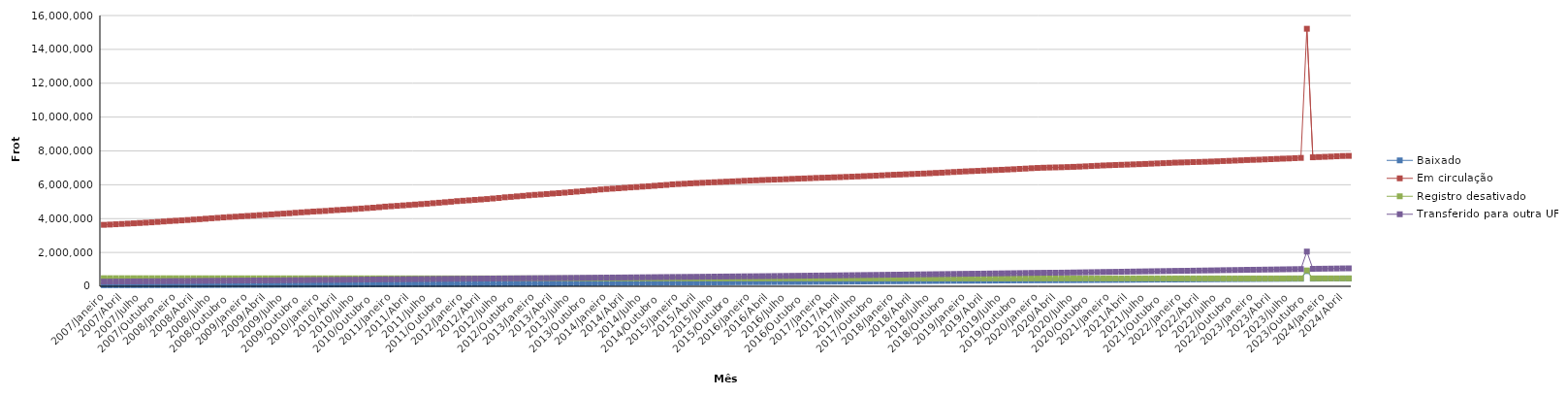
| Category | Baixado | Em circulação | Registro desativado | Transferido para outra UF |
|---|---|---|---|---|
| 2007/Janeiro | 64547 | 3632913 | 479318 | 276848 |
| 2007/Fevereiro | 64806 | 3648229 | 479069 | 278589 |
| 2007/Março | 65958 | 3666330 | 478732 | 281336 |
| 2007/Abril | 67104 | 3684659 | 478408 | 283482 |
| 2007/Maio | 67910 | 3703105 | 478111 | 286287 |
| 2007/Junho | 68357 | 3720760 | 477892 | 288677 |
| 2007/Julho | 68833 | 3740144 | 477650 | 291392 |
| 2007/Agosto | 69889 | 3760626 | 477365 | 294747 |
| 2007/Setembro | 70132 | 3780102 | 477124 | 297430 |
| 2007/Outubro | 71287 | 3804917 | 476840 | 300329 |
| 2007/Novembro | 72361 | 3829566 | 476562 | 302820 |
| 2007/Dezembro | 73891 | 3855215 | 476328 | 306596 |
| 2008/Janeiro | 74340 | 3875255 | 476076 | 308112 |
| 2008/Fevereiro | 75353 | 3894762 | 475708 | 310477 |
| 2008/Março | 75675 | 3918034 | 475517 | 313000 |
| 2008/Abril | 76548 | 3943442 | 475316 | 315593 |
| 2008/Maio | 77484 | 3966525 | 475140 | 318190 |
| 2008/Junho | 78077 | 3992143 | 474958 | 320898 |
| 2008/Julho | 78582 | 4020226 | 474670 | 324495 |
| 2008/Agosto | 79818 | 4043489 | 474450 | 327629 |
| 2008/Setembro | 81417 | 4069023 | 474182 | 330807 |
| 2008/Outubro | 82541 | 4093300 | 473971 | 333813 |
| 2008/Novembro | 84019 | 4112490 | 473775 | 336412 |
| 2008/Dezembro | 85156 | 4138550 | 473621 | 339835 |
| 2009/Janeiro | 85589 | 4157957 | 473439 | 341229 |
| 2009/Fevereiro | 85810 | 4177472 | 473325 | 342951 |
| 2009/Março | 86786 | 4203850 | 473151 | 345339 |
| 2009/Abril | 87201 | 4226174 | 473036 | 347728 |
| 2009/Maio | 88580 | 4247794 | 472889 | 350429 |
| 2009/Junho | 90837 | 4272968 | 472709 | 353099 |
| 2009/Julho | 92104 | 4294709 | 472576 | 356443 |
| 2009/Agosto | 92510 | 4317141 | 472442 | 359402 |
| 2009/Setembro | 94082 | 4344058 | 472278 | 362303 |
| 2009/Outubro | 95054 | 4369013 | 472137 | 365574 |
| 2009/Novembro | 97424 | 4390432 | 471956 | 368724 |
| 2009/Dezembro | 99897 | 4417646 | 471836 | 372932 |
| 2010/Janeiro | 100722 | 4435639 | 471726 | 374770 |
| 2010/Fevereiro | 101738 | 4453986 | 471639 | 377118 |
| 2010/Março | 103557 | 4483084 | 471523 | 380165 |
| 2010/Abril | 104790 | 4505426 | 471431 | 383245 |
| 2010/Maio | 106349 | 4525363 | 471326 | 386624 |
| 2010/Junho | 107893 | 4547457 | 471216 | 389555 |
| 2010/Julho | 110156 | 4570518 | 471118 | 392864 |
| 2010/Agosto | 112074 | 4594873 | 470979 | 396734 |
| 2010/Setembro | 113505 | 4620313 | 470821 | 400123 |
| 2010/Outubro | 115321 | 4645888 | 470695 | 403353 |
| 2010/Novembro | 116797 | 4674932 | 470572 | 406552 |
| 2010/Dezembro | 118610 | 4709614 | 470476 | 410966 |
| 2011/Janeiro | 119458 | 4730853 | 470334 | 412560 |
| 2011/Fevereiro | 120721 | 4753292 | 470223 | 415130 |
| 2011/Março | 122631 | 4779798 | 470113 | 417798 |
| 2011/Abril | 124288 | 4803932 | 469981 | 420366 |
| 2011/Maio | 126038 | 4830913 | 469848 | 423329 |
| 2011/Junho | 127706 | 4856554 | 469761 | 426350 |
| 2011/Julho | 129434 | 4882122 | 469687 | 429306 |
| 2011/Agosto | 131102 | 4911137 | 469586 | 432603 |
| 2011/Setembro | 132166 | 4939244 | 469509 | 435378 |
| 2011/Outubro | 133310 | 4967366 | 469435 | 437826 |
| 2011/Novembro | 134951 | 4997208 | 469335 | 440813 |
| 2011/Dezembro | 137543 | 5031931 | 469234 | 444680 |
| 2012/Janeiro | 139003 | 5055710 | 469149 | 446486 |
| 2012/Fevereiro | 140447 | 5078339 | 469080 | 448559 |
| 2012/Março | 142361 | 5106022 | 469058 | 451330 |
| 2012/Abril | 143914 | 5130446 | 469011 | 454018 |
| 2012/Maio | 145749 | 5155775 | 468931 | 457354 |
| 2012/Junho | 147258 | 5188180 | 468880 | 460047 |
| 2012/Julho | 149231 | 5219958 | 468795 | 462989 |
| 2012/Agosto | 151529 | 5257687 | 468716 | 465907 |
| 2012/Setembro | 152295 | 5282590 | 468654 | 468538 |
| 2012/Outubro | 154976 | 5313490 | 468590 | 471300 |
| 2012/Novembro | 156239 | 5344017 | 468540 | 473891 |
| 2012/Dezembro | 158685 | 5376302 | 468491 | 477243 |
| 2013/Janeiro | 159483 | 5404062 | 468426 | 479111 |
| 2013/Fevereiro | 160275 | 5424928 | 468389 | 481426 |
| 2013/Março | 161004 | 5453090 | 468350 | 484385 |
| 2013/Abril | 162630 | 5481312 | 468294 | 487380 |
| 2013/Maio | 167646 | 5506402 | 468237 | 490627 |
| 2013/Junho | 170054 | 5532795 | 468175 | 493935 |
| 2013/Julho | 172029 | 5563568 | 468111 | 497157 |
| 2013/Agosto | 173685 | 5593637 | 468066 | 500382 |
| 2013/Setembro | 175709 | 5622382 | 468025 | 503497 |
| 2013/Outubro | 178214 | 5656250 | 467984 | 506434 |
| 2013/Novembro | 180788 | 5684377 | 467929 | 509626 |
| 2013/Dezembro | 184184 | 5721904 | 467875 | 513337 |
| 2014/Janeiro | 186846 | 5748128 | 467833 | 515333 |
| 2014/Fevereiro | 189515 | 5770821 | 467796 | 518027 |
| 2014/Março | 191304 | 5793196 | 467765 | 520651 |
| 2014/Abril | 193693 | 5818542 | 467723 | 523579 |
| 2014/Maio | 196272 | 5843746 | 467685 | 527000 |
| 2014/Junho | 199573 | 5864261 | 467646 | 529836 |
| 2014/Julho | 201022 | 5890833 | 467613 | 533249 |
| 2014/Agosto | 204061 | 5913467 | 467568 | 536683 |
| 2014/Setembro | 206262 | 5939059 | 467520 | 540552 |
| 2014/Outubro | 207813 | 5966949 | 467458 | 544181 |
| 2014/Novembro | 211568 | 5989921 | 467415 | 547751 |
| 2014/Dezembro | 215162 | 6023696 | 467379 | 551647 |
| 2015/Janeiro | 217028 | 6044109 | 467345 | 553753 |
| 2015/Fevereiro | 218402 | 6060017 | 467305 | 556020 |
| 2015/Março | 219202 | 6081464 | 467278 | 558986 |
| 2015/Abril | 221394 | 6099731 | 467220 | 561996 |
| 2015/Maio | 224189 | 6116019 | 467185 | 565316 |
| 2015/Junho | 226275 | 6133070 | 467157 | 569023 |
| 2015/Julho | 229671 | 6149545 | 467059 | 573130 |
| 2015/Agosto | 231894 | 6166087 | 467023 | 576564 |
| 2015/Setembro | 234445 | 6182695 | 466986 | 579626 |
| 2015/Outubro | 236872 | 6199190 | 466943 | 582841 |
| 2015/Novembro | 240183 | 6214097 | 466913 | 586213 |
| 2015/Dezembro | 243927 | 6234770 | 466852 | 590382 |
| 2016/Janeiro | 245522 | 6248738 | 466827 | 592162 |
| 2016/Fevereiro | 246210 | 6262325 | 466802 | 594690 |
| 2016/Março | 247086 | 6278190 | 466775 | 598635 |
| 2016/Abril | 248683 | 6291879 | 466753 | 602485 |
| 2016/Maio | 251402 | 6303625 | 466728 | 606619 |
| 2016/Junho | 254051 | 6316998 | 466687 | 610546 |
| 2016/Julho | 255817 | 6330862 | 466660 | 614355 |
| 2016/Agosto | 257432 | 6345911 | 466628 | 618536 |
| 2016/Setembro | 258603 | 6359838 | 466602 | 622208 |
| 2016/Outubro | 261598 | 6372980 | 466570 | 625399 |
| 2016/Novembro | 264004 | 6386619 | 466542 | 629511 |
| 2016/Dezembro | 267778 | 6403542 | 466489 | 634447 |
| 2017/Janeiro | 270891 | 6414460 | 466453 | 637238 |
| 2017/Fevereiro | 272063 | 6425504 | 466433 | 640595 |
| 2017/Março | 275070 | 6439097 | 466401 | 644880 |
| 2017/Abril | 277340 | 6450292 | 466370 | 648542 |
| 2017/Maio | 279411 | 6464460 | 466342 | 652957 |
| 2017/Junho | 282084 | 6477985 | 466311 | 657295 |
| 2017/Julho | 283962 | 6492839 | 466292 | 661514 |
| 2017/Agosto | 286001 | 6509645 | 466269 | 666061 |
| 2017/Setembro | 289241 | 6523605 | 466241 | 670058 |
| 2017/Outubro | 291528 | 6539876 | 466216 | 674079 |
| 2017/Novembro | 293876 | 6556469 | 466194 | 678051 |
| 2017/Dezembro | 297459 | 6574700 | 466163 | 683407 |
| 2018/Janeiro | 298212 | 6590826 | 466146 | 686456 |
| 2018/Fevereiro | 299515 | 6604032 | 466121 | 689793 |
| 2018/Março | 301924 | 6620257 | 466106 | 693866 |
| 2018/Abril | 305125 | 6635037 | 466100 | 698484 |
| 2018/Maio | 307134 | 6650360 | 466084 | 703240 |
| 2018/Junho | 311033 | 6663398 | 466070 | 707342 |
| 2018/Julho | 313627 | 6679835 | 466056 | 711632 |
| 2018/Agosto | 316765 | 6698043 | 466038 | 716178 |
| 2018/Setembro | 319461 | 6713951 | 466018 | 720299 |
| 2018/Outubro | 321660 | 6734626 | 466004 | 724869 |
| 2018/Novembro | 324093 | 6753405 | 465986 | 729042 |
| 2018/Dezembro | 326366 | 6772764 | 465972 | 734711 |
| 2019/Janeiro | 327423 | 6790625 | 465953 | 738051 |
| 2019/Fevereiro | 329537 | 6805350 | 465935 | 742376 |
| 2019/Março | 331558 | 6819940 | 465923 | 746320 |
| 2019/Abril | 333812 | 6837406 | 465911 | 750807 |
| 2019/Maio | 335375 | 6855139 | 465895 | 756069 |
| 2019/Junho | 338802 | 6868961 | 465874 | 760496 |
| 2019/Julho | 342323 | 6884629 | 465851 | 765597 |
| 2019/Agosto | 344965 | 6901309 | 465822 | 770563 |
| 2019/Setembro | 347619 | 6917855 | 465822 | 775237 |
| 2019/Outubro | 349718 | 6938080 | 465806 | 780181 |
| 2019/Novembro | 350970 | 6955582 | 465782 | 785458 |
| 2019/Dezembro | 352965 | 6977604 | 465765 | 791558 |
| 2020/Janeiro | 354489 | 6993809 | 465743 | 795025 |
| 2020/Fevereiro | 356147 | 7007299 | 465715 | 799245 |
| 2020/Março | 358271 | 7017800 | 465698 | 802476 |
| 2020/Abril | 359104 | 7025685 | 465695 | 803411 |
| 2020/Maio | 360905 | 7034398 | 465673 | 806772 |
| 2020/Junho | 361785 | 7046336 | 465663 | 811197 |
| 2020/Julho | 363737 | 7058503 | 465630 | 817382 |
| 2020/Agosto | 366053 | 7072187 | 465612 | 822817 |
| 2020/Setembro | 368272 | 7089198 | 465602 | 828132 |
| 2020/Outubro | 370945 | 7106270 | 465584 | 833959 |
| 2020/Novembro | 372976 | 7123342 | 465560 | 839430 |
| 2020/Dezembro | 376228 | 7141018 | 465548 | 847035 |
| 2021/Janeiro | 377555 | 7154202 | 465534 | 850390 |
| 2021/Fevereiro | 379405 | 7166783 | 465522 | 855047 |
| 2021/Março | 380932 | 7179662 | 465495 | 860741 |
| 2021/Abril | 383163 | 7191840 | 465472 | 866135 |
| 2021/Maio | 386946 | 7204292 | 465446 | 871834 |
| 2021/Junho | 390338 | 7217202 | 465420 | 877449 |
| 2021/Julho | 393298 | 7231674 | 465394 | 883283 |
| 2021/Agosto | 395853 | 7246464 | 465378 | 888932 |
| 2021/Setembro | 397391 | 7262038 | 465366 | 893961 |
| 2021/Outubro | 399445 | 7276487 | 465355 | 899094 |
| 2021/Novembro | 401139 | 7291245 | 465330 | 904371 |
| 2021/Dezembro | 402824 | 7308202 | 465309 | 911205 |
| 2022/Janeiro | 404369 | 7317463 | 465282 | 914677 |
| 2022/Fevereiro | 405982 | 7327786 | 465272 | 918882 |
| 2022/Março | 408560 | 7338858 | 465197 | 924029 |
| 2022/Abril | 410812 | 7349180 | 465171 | 929047 |
| 2022/Maio | 414919 | 7360072 | 465151 | 934909 |
| 2022/Junho | 417314 | 7371801 | 465119 | 940156 |
| 2022/Julho | 418786 | 7385240 | 465110 | 945435 |
| 2022/Agosto | 421921 | 7402487 | 465088 | 952539 |
| 2022/Setembro | 424038 | 7413277 | 465078 | 956716 |
| 2022/Outubro | 425585 | 7428746 | 465051 | 961744 |
| 2022/Novembro | 427170 | 7444175 | 465037 | 966765 |
| 2022/Dezembro | 429144 | 7461889 | 465022 | 973401 |
| 2023/Janeiro | 431603 | 7472618 | 465011 | 977261 |
| 2023/Fevereiro | 433996 | 7483155 | 464993 | 981388 |
| 2023/Março | 436466 | 7499186 | 464971 | 987327 |
| 2023/Abril | 437820 | 7512954 | 464955 | 991824 |
| 2023/Maio | 440317 | 7528453 | 464934 | 997404 |
| 2023/Junho | 442823 | 7543324 | 464923 | 1002573 |
| 2023/Julho | 444985 | 7554573 | 468641 | 1008076 |
| 2023/Agosto | 446725 | 7571916 | 468607 | 1014353 |
| 2023/Setembro | 448250 | 7587889 | 468586 | 1019244 |
| 2023/Outubro | 900593 | 15217617 | 937144 | 2052214 |
| 2023/Novembro | 452695 | 7622602 | 468553 | 1030912 |
| 2023/Dezembro | 455129 | 7637859 | 468538 | 1037201 |
| 2024/Janeiro | 456552 | 7651561 | 468512 | 1041589 |
| 2024/Fevereiro | 458459 | 7665477 | 468495 | 1046365 |
| 2024/Março | 460012 | 7682155 | 468482 | 1051577 |
| 2024/Abril | 462223 | 7699513 | 468467 | 1057459 |
| 2024/Maio | 462498 | 7705539 | 468467 | 1060087 |